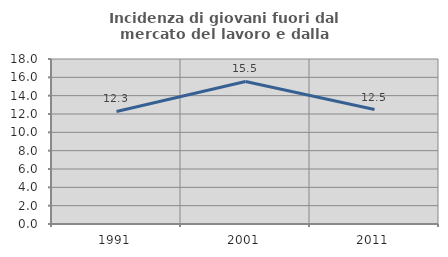
| Category | Incidenza di giovani fuori dal mercato del lavoro e dalla formazione  |
|---|---|
| 1991.0 | 12.276 |
| 2001.0 | 15.546 |
| 2011.0 | 12.486 |